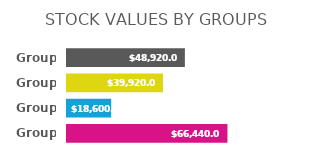
| Category | Series 0 |
|---|---|
| Group 1 | 48920 |
| Group 2 | 39920 |
| Group 3 | 18600 |
| Group 4 | 66440 |